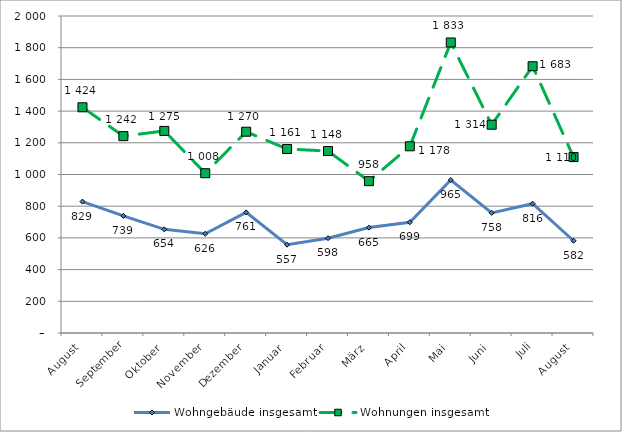
| Category | Wohngebäude insgesamt | Wohnungen insgesamt |
|---|---|---|
| August | 829 | 1424 |
| September | 739 | 1242 |
| Oktober | 654 | 1275 |
| November | 626 | 1008 |
| Dezember | 761 | 1270 |
| Januar | 557 | 1161 |
| Februar | 598 | 1148 |
| März | 665 | 958 |
| April | 699 | 1178 |
| Mai | 965 | 1833 |
| Juni | 758 | 1314 |
| Juli | 816 | 1683 |
| August | 582 | 1110 |